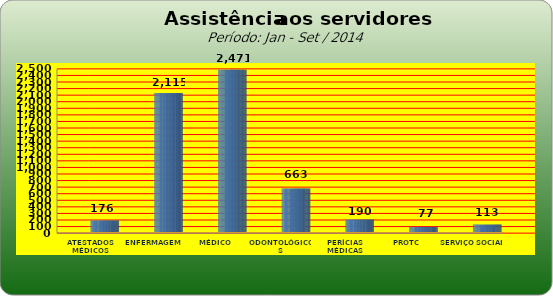
| Category | Series 0 |
|---|---|
| ATESTADOS MÉDICOS | 176 |
| ENFERMAGEM | 2115 |
| MÉDICO | 2471 |
| ODONTOLÓGICOS | 663 |
| PERÍCIAS MÉDICAS | 190 |
| PROTC | 77 |
| SERVIÇO SOCIAL | 113 |